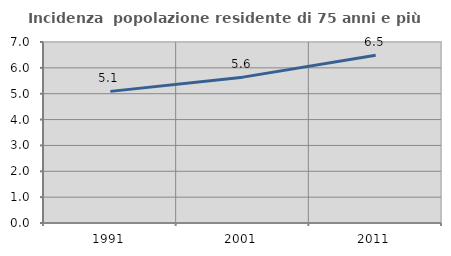
| Category | Incidenza  popolazione residente di 75 anni e più |
|---|---|
| 1991.0 | 5.09 |
| 2001.0 | 5.641 |
| 2011.0 | 6.484 |